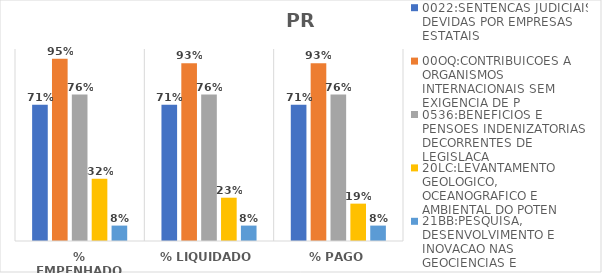
| Category | 0022:SENTENCAS JUDICIAIS DEVIDAS POR EMPRESAS ESTATAIS | 00OQ:CONTRIBUICOES A ORGANISMOS INTERNACIONAIS SEM EXIGENCIA DE P | 0536:BENEFICIOS E PENSOES INDENIZATORIAS DECORRENTES DE LEGISLACA | 20LC:LEVANTAMENTO GEOLOGICO, OCEANOGRAFICO E AMBIENTAL DO POTEN | 21BB:PESQUISA, DESENVOLVIMENTO E INOVACAO NAS GEOCIENCIAS E |
|---|---|---|---|---|---|
| % EMPENHADO | 0.71 | 0.95 | 0.763 | 0.325 | 0.08 |
| % LIQUIDADO | 0.71 | 0.926 | 0.763 | 0.225 | 0.08 |
| % PAGO | 0.71 | 0.926 | 0.763 | 0.195 | 0.08 |